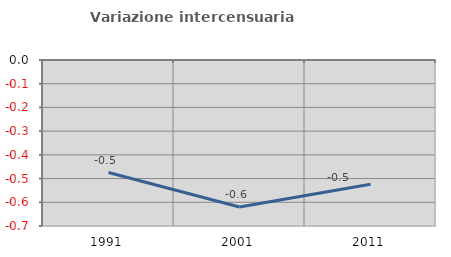
| Category | Variazione intercensuaria annua |
|---|---|
| 1991.0 | -0.475 |
| 2001.0 | -0.62 |
| 2011.0 | -0.524 |